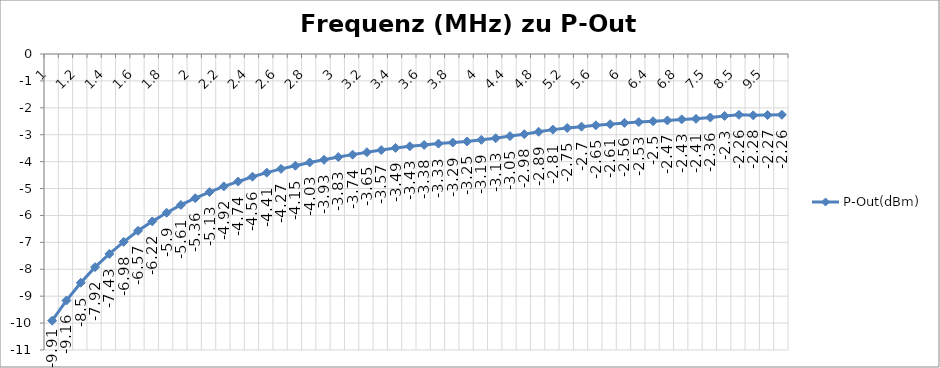
| Category | P-Out(dBm) |
|---|---|
| 1.0 | -9.91 |
| 1.1 | -9.16 |
| 1.2 | -8.5 |
| 1.3 | -7.92 |
| 1.4 | -7.43 |
| 1.5 | -6.98 |
| 1.6 | -6.57 |
| 1.7 | -6.22 |
| 1.8 | -5.9 |
| 1.9 | -5.61 |
| 2.0 | -5.36 |
| 2.1 | -5.13 |
| 2.2 | -4.92 |
| 2.3 | -4.74 |
| 2.4 | -4.56 |
| 2.5 | -4.41 |
| 2.6 | -4.27 |
| 2.7 | -4.15 |
| 2.8 | -4.03 |
| 2.9 | -3.93 |
| 3.0 | -3.83 |
| 3.1 | -3.74 |
| 3.2 | -3.65 |
| 3.3 | -3.57 |
| 3.4 | -3.49 |
| 3.5 | -3.43 |
| 3.6 | -3.38 |
| 3.7 | -3.33 |
| 3.8 | -3.29 |
| 3.9 | -3.25 |
| 4.0 | -3.19 |
| 4.2 | -3.13 |
| 4.4 | -3.05 |
| 4.6 | -2.98 |
| 4.8 | -2.89 |
| 5.0 | -2.81 |
| 5.2 | -2.75 |
| 5.4 | -2.7 |
| 5.6 | -2.65 |
| 5.8 | -2.61 |
| 6.0 | -2.56 |
| 6.2 | -2.53 |
| 6.4 | -2.5 |
| 6.6 | -2.47 |
| 6.8 | -2.43 |
| 7.0 | -2.41 |
| 7.5 | -2.36 |
| 8.0 | -2.3 |
| 8.5 | -2.26 |
| 9.0 | -2.28 |
| 9.5 | -2.27 |
| 10.0 | -2.26 |